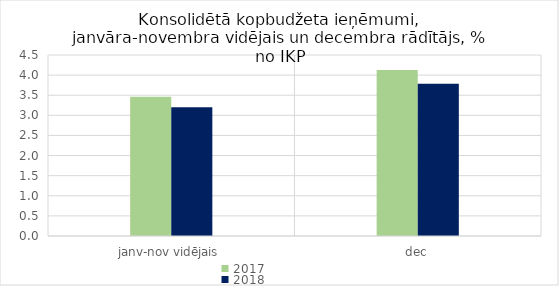
| Category | 2017 | 2018 |
|---|---|---|
| janv-nov vidējais | 3.463 | 3.2 |
| dec | 4.128 | 3.784 |